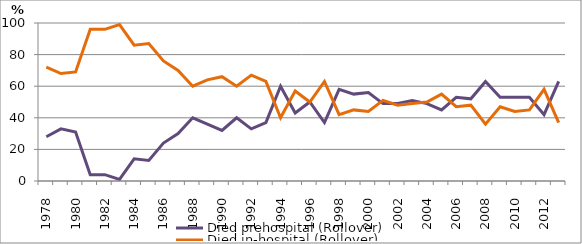
| Category | Died prehospital (Rollover) | Died in-hospital (Rollover) |
|---|---|---|
| 1978.0 | 28 | 72 |
| 1979.0 | 33 | 68 |
| 1980.0 | 31 | 69 |
| 1981.0 | 4 | 96 |
| 1982.0 | 4 | 96 |
| 1983.0 | 1 | 99 |
| 1984.0 | 14 | 86 |
| 1985.0 | 13 | 87 |
| 1986.0 | 24 | 76 |
| 1987.0 | 30 | 70 |
| 1988.0 | 40 | 60 |
| 1989.0 | 36 | 64 |
| 1990.0 | 32 | 66 |
| 1991.0 | 40 | 60 |
| 1992.0 | 33 | 67 |
| 1993.0 | 37 | 63 |
| 1994.0 | 60 | 40 |
| 1995.0 | 43 | 57 |
| 1996.0 | 50 | 50 |
| 1997.0 | 37 | 63 |
| 1998.0 | 58 | 42 |
| 1999.0 | 55 | 45 |
| 2000.0 | 56 | 44 |
| 2001.0 | 49 | 51 |
| 2002.0 | 49 | 48 |
| 2003.0 | 51 | 49 |
| 2004.0 | 49 | 50 |
| 2005.0 | 45 | 55 |
| 2006.0 | 53 | 47 |
| 2007.0 | 52 | 48 |
| 2008.0 | 63 | 36 |
| 2009.0 | 53 | 47 |
| 2010.0 | 53 | 44 |
| 2011.0 | 53 | 45 |
| 2012.0 | 42 | 58 |
| 2013.0 | 63 | 37 |